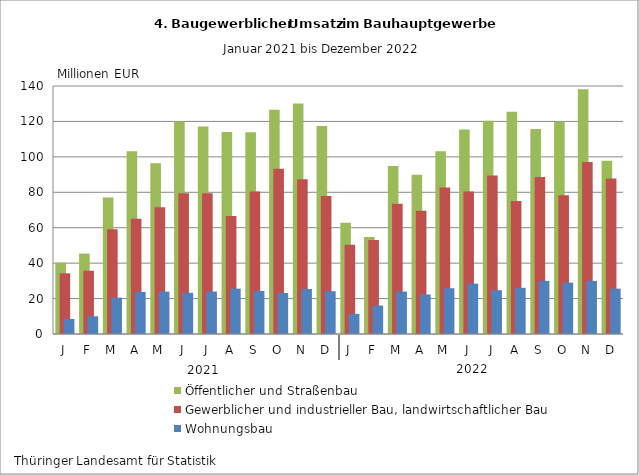
| Category | Öffentlicher und Straßenbau | Gewerblicher und industrieller Bau, landwirtschaftlicher Bau | Wohnungsbau |
|---|---|---|---|
| J | 40.247 | 34.257 | 8.495 |
| F | 45.403 | 35.705 | 10.014 |
| M | 77.037 | 59.127 | 20.555 |
| A | 103.133 | 65.098 | 23.733 |
| M | 96.385 | 71.575 | 23.945 |
| J | 119.977 | 79.482 | 23.268 |
| J | 117.087 | 79.446 | 23.943 |
| A | 114.082 | 66.66 | 25.586 |
| S | 113.88 | 80.378 | 24.312 |
| O | 126.61 | 93.246 | 23.163 |
| N | 130.088 | 87.308 | 25.431 |
| D | 117.426 | 77.97 | 24.166 |
| J | 62.855 | 50.447 | 11.346 |
| F | 54.729 | 53.076 | 16.069 |
| M | 94.807 | 73.587 | 23.932 |
| A | 89.915 | 69.57 | 22.315 |
| M | 103.107 | 82.741 | 25.829 |
| J | 115.413 | 80.509 | 28.389 |
| J | 120.404 | 89.44 | 24.721 |
| A | 125.468 | 75.143 | 26.072 |
| S | 115.712 | 88.59 | 29.999 |
| O | 120.027 | 78.307 | 28.974 |
| N | 138.215 | 97.042 | 29.961 |
| D | 97.802 | 87.746 | 25.599 |